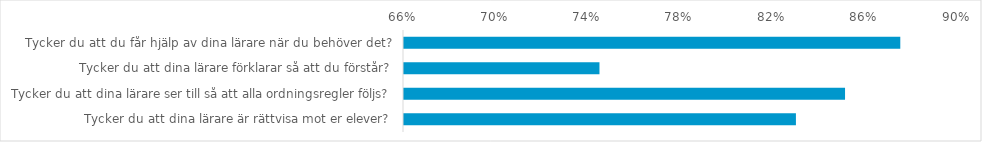
| Category | (Alla) |
|---|---|
| Tycker du att du får hjälp av dina lärare när du behöver det? | 0.875 |
| Tycker du att dina lärare förklarar så att du förstår? | 0.745 |
| Tycker du att dina lärare ser till så att alla ordningsregler följs? | 0.851 |
| Tycker du att dina lärare är rättvisa mot er elever? | 0.83 |